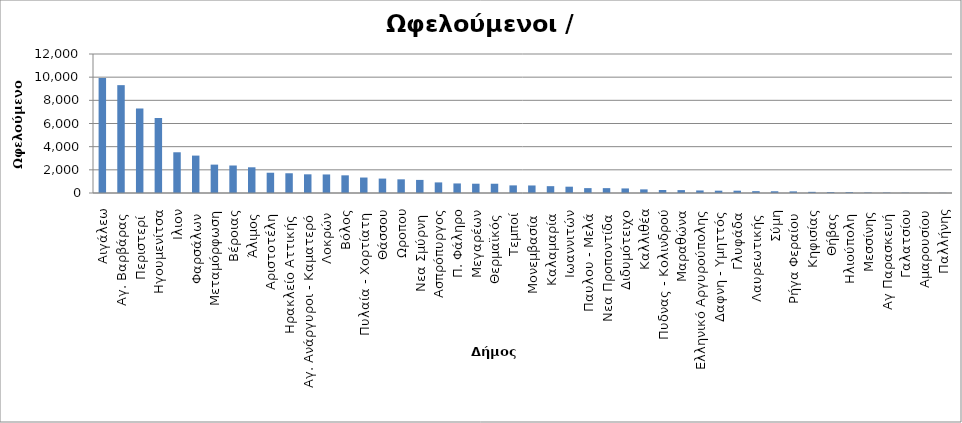
| Category | Series 0 |
|---|---|
|  Αιγάλεω | 9932 |
| Αγ. Βαρβάρας  | 9311 |
| Περιστερί  | 7296 |
| Ηγουμενίτσα | 6477 |
| Ιλιον | 3516 |
| Φαρσάλων  | 3229 |
| Μεταμόρφωση | 2450 |
| Βέροιας | 2374 |
| Άλιμος  | 2219 |
| Αριστοτέλη  | 1750 |
| Ηρακλείο Αττικής  | 1704 |
| Αγ. Ανάργυροι - Καματερό  | 1613 |
| Λοκρών  | 1601 |
| Βόλος | 1525 |
| Πυλαία - Χορτίατη  | 1335 |
| Θάσσου | 1245 |
| Ωροπου | 1180 |
| Νεα Σμύρνη  | 1130 |
| Ασπρόπυργος | 915 |
| Π. Φάληρο | 825 |
| Μεγαρέων | 802 |
| Θερμαϊκός  | 800 |
| Τεμποί  | 658 |
| Μονεμβασία  | 650 |
| Καλαμαρία  | 590 |
| Ιωαννιτών | 545 |
| Παυλου - Μελά  | 421 |
| Νεα Προποντίδα  | 420 |
| Διδυμότειχο | 395 |
| Καλλιθέα | 313 |
| Πυδνας - Κολινδρού | 258 |
| Μαραθώνα | 250 |
| Ελληνικό Αργυρούπολης | 220 |
| Δαφνη - Υμηττός | 201 |
| Γλυφάδα  | 200 |
| Λαυρεωτικής  | 160 |
| Σύμη | 149 |
| Ρήγα Φεραίου  | 140 |
| Κηφισίας | 100 |
| Θήβας  | 73 |
| Ηλιούπολη  | 71 |
| Μεσσίνης | 40 |
| Αγ Παρασκευή  | 36 |
| Γαλατσίου | 24 |
| Αμαρουσίου | 18 |
| Παλλήνης | 14 |